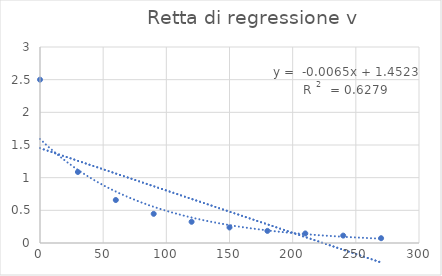
| Category | Series 0 |
|---|---|
| 0.0 | 2.5 |
| 30.0 | 1.087 |
| 60.0 | 0.658 |
| 90.0 | 0.446 |
| 120.0 | 0.325 |
| 150.0 | 0.238 |
| 180.0 | 0.185 |
| 210.0 | 0.146 |
| 240.0 | 0.113 |
| 270.0 | 0.073 |